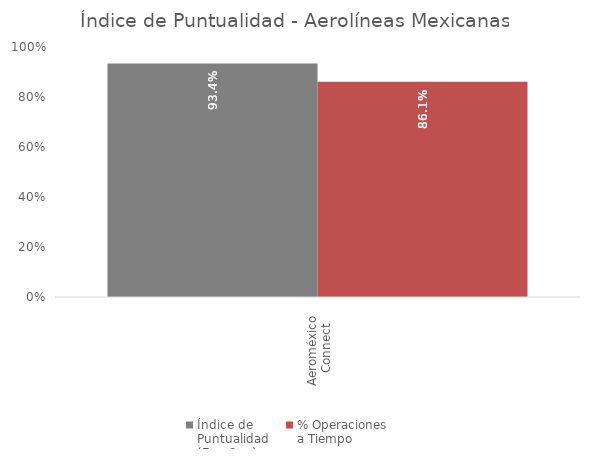
| Category | Índice de 
Puntualidad
(Ene-Sep) | % Operaciones 
a Tiempo |
|---|---|---|
| Aeroméxico 
Connect | 0.934 | 0.861 |